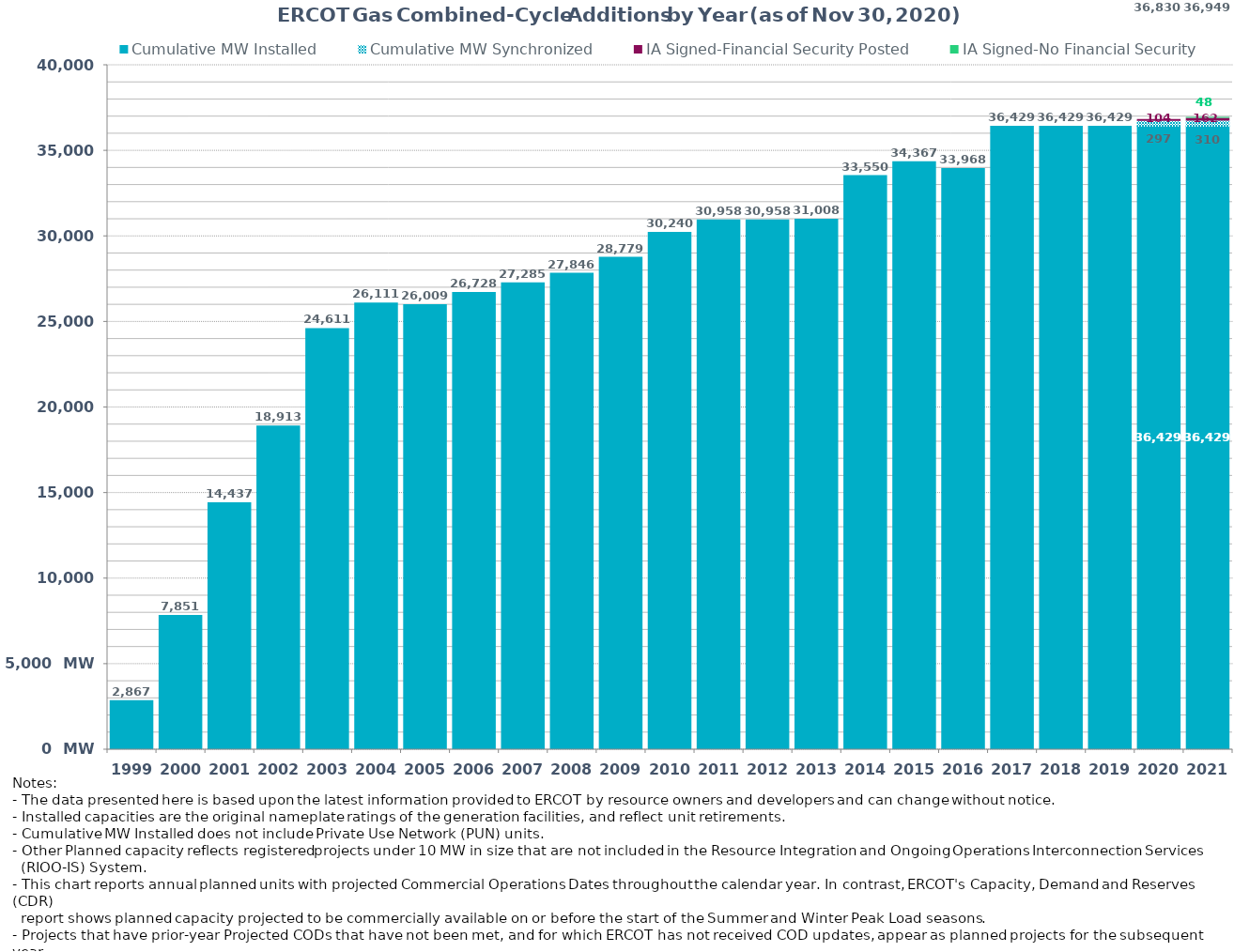
| Category | Cumulative MW Installed | Cumulative MW Synchronized | IA Signed-Financial Security Posted  | IA Signed-No Financial Security  | Other Planned | Cumulative Installed and Planned |
|---|---|---|---|---|---|---|
| 1999.0 | 2867 | 0 | 0 | 0 | 0 | 2867 |
| 2000.0 | 7851 | 0 | 0 | 0 | 0 | 7851 |
| 2001.0 | 14437 | 0 | 0 | 0 | 0 | 14437 |
| 2002.0 | 18913 | 0 | 0 | 0 | 0 | 18913 |
| 2003.0 | 24611 | 0 | 0 | 0 | 0 | 24611 |
| 2004.0 | 26111 | 0 | 0 | 0 | 0 | 26111 |
| 2005.0 | 26009 | 0 | 0 | 0 | 0 | 26009 |
| 2006.0 | 26728 | 0 | 0 | 0 | 0 | 26728 |
| 2007.0 | 27285 | 0 | 0 | 0 | 0 | 27285 |
| 2008.0 | 27846 | 0 | 0 | 0 | 0 | 27846 |
| 2009.0 | 28779 | 0 | 0 | 0 | 0 | 28779 |
| 2010.0 | 30240 | 0 | 0 | 0 | 0 | 30240 |
| 2011.0 | 30958 | 0 | 0 | 0 | 0 | 30958 |
| 2012.0 | 30958 | 0 | 0 | 0 | 0 | 30958 |
| 2013.0 | 31008 | 0 | 0 | 0 | 0 | 31008 |
| 2014.0 | 33550 | 0 | 0 | 0 | 0 | 33550 |
| 2015.0 | 34367 | 0 | 0 | 0 | 0 | 34367 |
| 2016.0 | 33968 | 0 | 0 | 0 | 0 | 33968 |
| 2017.0 | 36429 | 0 | 0 | 0 | 0 | 36429 |
| 2018.0 | 36429 | 0 | 0 | 0 | 0 | 36429 |
| 2019.0 | 36429 | 0 | 0 | 0 | 0 | 36429 |
| 2020.0 | 36429 | 297 | 104 | 0 | 0 | 36830 |
| 2021.0 | 36429 | 310 | 162 | 48 | 0 | 36949 |